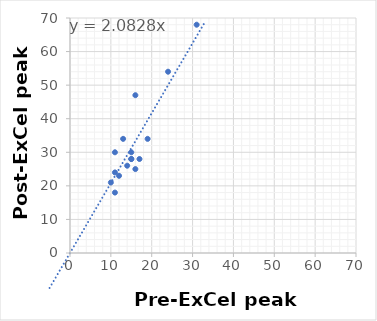
| Category | Series 0 |
|---|---|
| 24.0 | 54 |
| 13.0 | 34 |
| 11.0 | 30 |
| 15.0 | 28 |
| 12.0 | 23 |
| 11.0 | 24 |
| 19.0 | 34 |
| 15.0 | 30 |
| 16.0 | 47 |
| 31.0 | 68 |
| 15.0 | 28 |
| 16.0 | 25 |
| 10.0 | 21 |
| 14.0 | 26 |
| 17.0 | 28 |
| 11.0 | 18 |